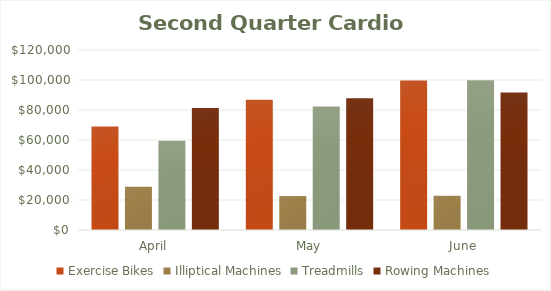
| Category | Exercise Bikes | Illiptical Machines | Treadmills | Rowing Machines |
|---|---|---|---|---|
| April | 68991.12 | 28836 | 59519.78 | 81267.17 |
| May | 86894.82 | 22634.23 | 82337.98 | 87867.5 |
| June | 99650.58 | 22828.78 | 99823.87 | 91669.98 |